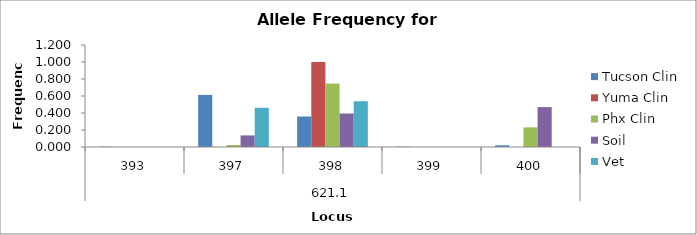
| Category | Tucson Clin | Yuma Clin | Phx Clin | Soil | Vet |
|---|---|---|---|---|---|
| 0 | 0.004 | 0 | 0 | 0 | 0 |
| 1 | 0.613 | 0 | 0.023 | 0.136 | 0.462 |
| 2 | 0.359 | 1 | 0.746 | 0.394 | 0.538 |
| 3 | 0.004 | 0 | 0 | 0 | 0 |
| 4 | 0.02 | 0 | 0.231 | 0.47 | 0 |